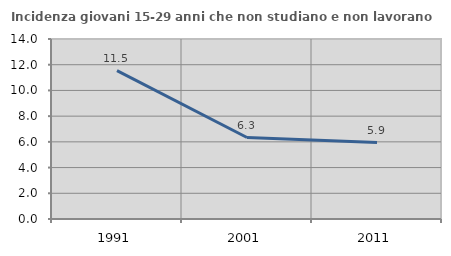
| Category | Incidenza giovani 15-29 anni che non studiano e non lavorano  |
|---|---|
| 1991.0 | 11.538 |
| 2001.0 | 6.338 |
| 2011.0 | 5.941 |